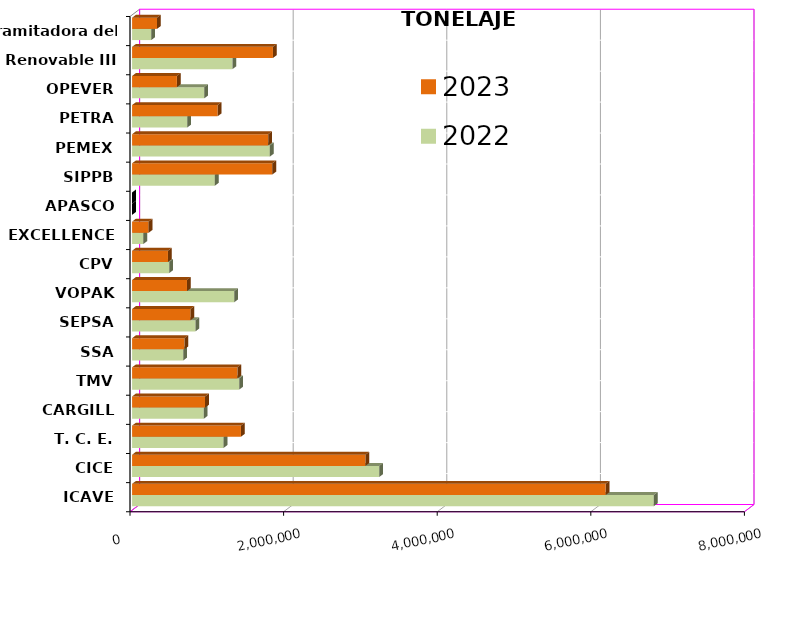
| Category | 2022 | 2023 |
|---|---|---|
| ICAVE | 6793069.391 | 6166039.466 |
| CICE | 3217127.578 | 3038512.667 |
| T. C. E. | 1191682.315 | 1417291.853 |
| CARGILL | 932693.161 | 950867.262 |
| TMV | 1393786.83 | 1371064.93 |
| SSA | 664941.398 | 681082.486 |
| SEPSA | 824495.01 | 760904.94 |
| VOPAK | 1330146.993 | 714588.35 |
| CPV | 483010.64 | 466946.711 |
| EXCELLENCE | 146300.787 | 215085.556 |
| APASCO | 0 | 0 |
| SIPPB | 1077433.806 | 1825857.39 |
| PEMEX | 1793978.99 | 1772555.587 |
| PETRA | 718626.83 | 1114479.313 |
| OPEVER | 940034.689 | 583269.159 |
| ESJ Renovable III | 1306300.354 | 1834044.095 |
| Tramitadora del Pac. | 249972.966 | 324408.052 |